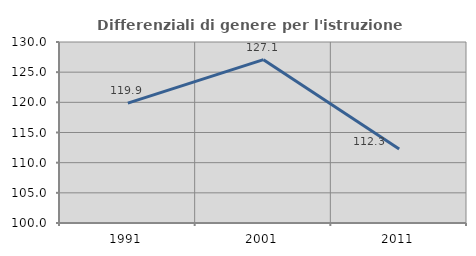
| Category | Differenziali di genere per l'istruzione superiore |
|---|---|
| 1991.0 | 119.861 |
| 2001.0 | 127.071 |
| 2011.0 | 112.279 |